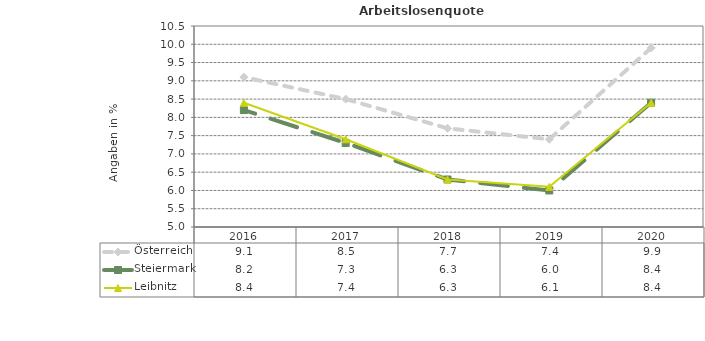
| Category | Österreich | Steiermark | Leibnitz |
|---|---|---|---|
| 2020.0 | 9.9 | 8.4 | 8.4 |
| 2019.0 | 7.4 | 6 | 6.1 |
| 2018.0 | 7.7 | 6.3 | 6.3 |
| 2017.0 | 8.5 | 7.3 | 7.4 |
| 2016.0 | 9.1 | 8.2 | 8.4 |